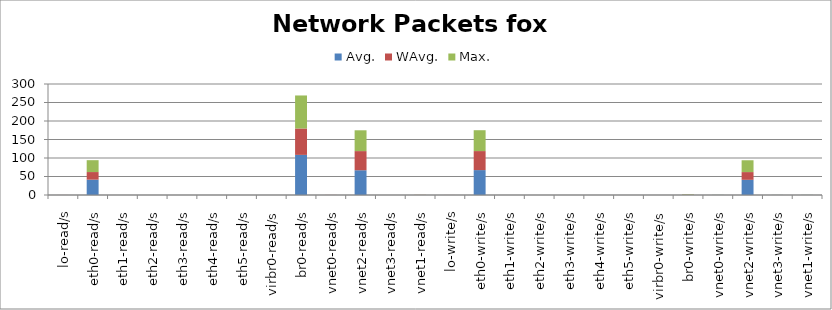
| Category | Avg. | WAvg. | Max. |
|---|---|---|---|
| lo-read/s | 0.002 | 0.098 | 0 |
| eth0-read/s | 41.442 | 20.565 | 32.094 |
| eth1-read/s | 0 | 0 | 0 |
| eth2-read/s | 0 | 0 | 0 |
| eth3-read/s | 0 | 0 | 0 |
| eth4-read/s | 0 | 0 | 0 |
| eth5-read/s | 0 | 0 | 0 |
| virbr0-read/s | 0 | 0 | 0 |
| br0-read/s | 108.42 | 71.377 | 89.203 |
| vnet0-read/s | 0.003 | 0.197 | 0 |
| vnet2-read/s | 66.893 | 51.763 | 56.244 |
| vnet3-read/s | 0 | 0 | 0 |
| vnet1-read/s | 0.06 | 0.246 | 0.194 |
| lo-write/s | 0.002 | 0.098 | 0 |
| eth0-write/s | 67.315 | 51.401 | 56.384 |
| eth1-write/s | 0 | 0 | 0 |
| eth2-write/s | 0 | 0 | 0 |
| eth3-write/s | 0 | 0 | 0 |
| eth4-write/s | 0 | 0 | 0 |
| eth5-write/s | 0 | 0 | 0 |
| virbr0-write/s | 0 | 0 | 0 |
| br0-write/s | 0.395 | 0.593 | 1.212 |
| vnet0-write/s | 0.222 | 0.018 | 0.26 |
| vnet2-write/s | 41.013 | 20.922 | 31.965 |
| vnet3-write/s | 0.217 | 0.013 | 0.171 |
| vnet1-write/s | 0.22 | 0.024 | 0.256 |